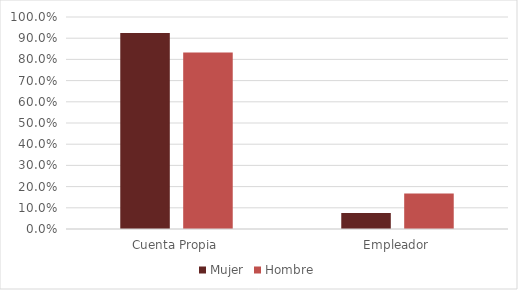
| Category | Mujer | Hombre |
|---|---|---|
| Cuenta Propia | 0.924 | 0.832 |
| Empleador | 0.076 | 0.168 |